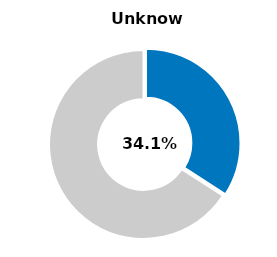
| Category | Series 0 |
|---|---|
| Unknown | 0.341 |
| Other | 0.659 |